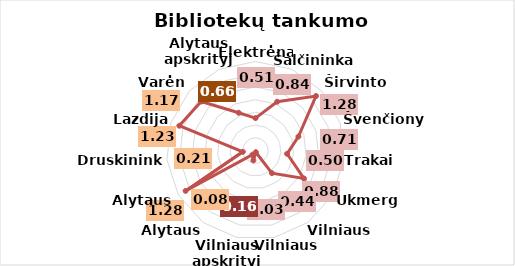
| Category | Series 0 |
|---|---|
| Elektrėnai | 0.51 |
| Šalčininkai | 0.84 |
| Širvintos | 1.28 |
| Švenčionys | 0.71 |
| Trakai | 0.5 |
| Ukmergė | 0.88 |
| Vilniaus r. | 0.44 |
| Vilniaus m. | 0.028 |
| Vilniaus apskrityje | 0.16 |
| Alytaus m. | 0.08 |
| Alytaus r. | 1.27 |
| Druskininkai | 0.2 |
| Lazdijai | 1.26 |
| Varėna | 1.15 |
| Alytaus apskrityje | 0.65 |